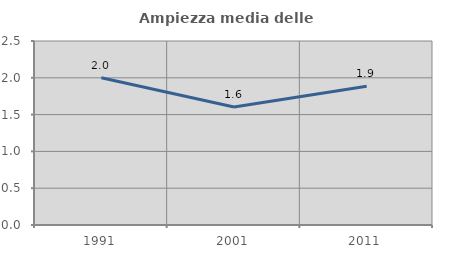
| Category | Ampiezza media delle famiglie |
|---|---|
| 1991.0 | 2 |
| 2001.0 | 1.604 |
| 2011.0 | 1.886 |